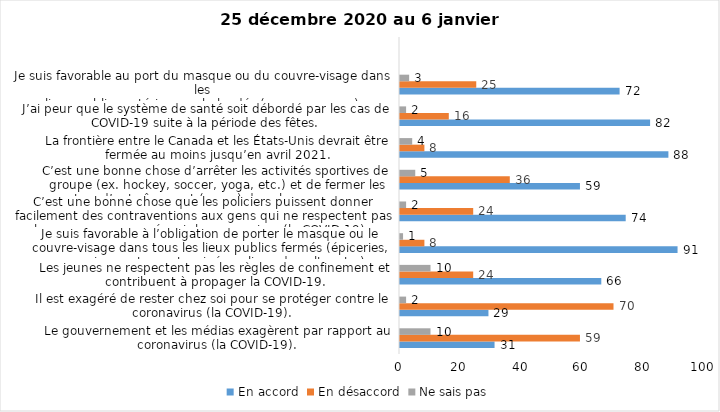
| Category | En accord | En désaccord | Ne sais pas |
|---|---|---|---|
| Le gouvernement et les médias exagèrent par rapport au coronavirus (la COVID-19). | 31 | 59 | 10 |
| Il est exagéré de rester chez soi pour se protéger contre le coronavirus (la COVID-19). | 29 | 70 | 2 |
| Les jeunes ne respectent pas les règles de confinement et contribuent à propager la COVID-19. | 66 | 24 | 10 |
| Je suis favorable à l’obligation de porter le masque ou le couvre-visage dans tous les lieux publics fermés (épiceries, magasins, restaurants, cinéma, lieux de culte, etc.). | 91 | 8 | 1 |
| C’est une bonne chose que les policiers puissent donner facilement des contraventions aux gens qui ne respectent pas les mesures pour prévenir le coronavirus (la COVID-19). | 74 | 24 | 2 |
| C’est une bonne chose d’arrêter les activités sportives de groupe (ex. hockey, soccer, yoga, etc.) et de fermer les centres d’entraînement (gyms) dans les zones rouges. | 59 | 36 | 5 |
| La frontière entre le Canada et les États-Unis devrait être fermée au moins jusqu’en avril 2021. | 88 | 8 | 4 |
| J’ai peur que le système de santé soit débordé par les cas de COVID-19 suite à la période des fêtes. | 82 | 16 | 2 |
| Je suis favorable au port du masque ou du couvre-visage dans les
lieux publics extérieurs achalandés (ex. rues, parcs) | 72 | 25 | 3 |